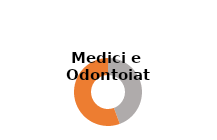
| Category | Series 0 |
|---|---|
| Donne  | 0.444 |
| Uomini  | 0.556 |